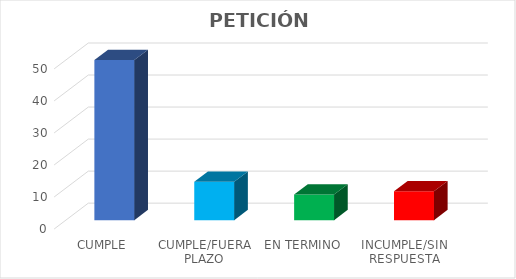
| Category | TOTAL |
|---|---|
| CUMPLE | 50 |
| CUMPLE/FUERA PLAZO | 12 |
| EN TERMINO | 8 |
| INCUMPLE/SIN RESPUESTA | 9 |